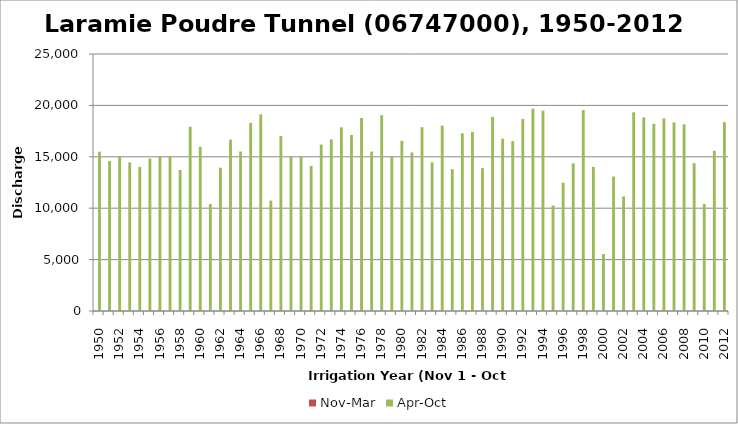
| Category | Nov-Mar | Apr-Oct |
|---|---|---|
| 1950.0 | 0 | 15495.1 |
| 1951.0 | 0 | 14582.68 |
| 1952.0 | 0 | 15068.65 |
| 1953.0 | 0 | 14451.19 |
| 1954.0 | 0 | 14017.4 |
| 1955.0 | 0 | 14818.72 |
| 1956.0 | 0 | 15005.18 |
| 1957.0 | 0 | 15054.76 |
| 1958.0 | 0 | 13717.89 |
| 1959.0 | 0 | 17926.87 |
| 1960.0 | 0 | 15978.88 |
| 1961.0 | 0 | 10407.42 |
| 1962.0 | 0 | 13943.82 |
| 1963.0 | 0 | 16671.32 |
| 1964.0 | 0 | 15514.94 |
| 1965.0 | 0 | 18297.79 |
| 1966.0 | 0 | 19130.25 |
| 1967.0 | 0 | 10740.65 |
| 1968.0 | 0 | 17034.3 |
| 1969.0 | 0 | 14999.23 |
| 1970.0 | 0 | 14989.32 |
| 1971.0 | 0 | 14114.59 |
| 1972.0 | 0 | 16189.54 |
| 1973.0 | 0 | 16691.15 |
| 1974.0 | 0 | 17873.32 |
| 1975.0 | 0 | 17127.92 |
| 1976.0 | 0 | 18775.81 |
| 1977.0 | 0 | 15511.17 |
| 1978.0 | 0 | 19052.51 |
| 1979.0 | 0 | 15044.45 |
| 1980.0 | 0 | 16554.28 |
| 1981.0 | 0 | 15421.91 |
| 1982.0 | 0 | 17880.67 |
| 1983.0 | 0 | 14465.67 |
| 1984.0 | 0 | 18033.98 |
| 1985.0 | 0 | 13789.3 |
| 1986.0 | 0 | 17292.15 |
| 1987.0 | 0 | 17423.06 |
| 1988.0 | 0 | 13898.19 |
| 1989.0 | 0 | 18884.07 |
| 1990.0 | 0 | 16759.39 |
| 1991.0 | 0 | 16533.26 |
| 1992.0 | 0 | 18683.97 |
| 1993.0 | 0 | 19687.76 |
| 1994.0 | 0 | 19488.74 |
| 1995.0 | 0 | 10263.46 |
| 1996.0 | 0 | 12478.6 |
| 1997.0 | 0 | 14368.27 |
| 1998.0 | 0 | 19545.42 |
| 1999.0 | 0 | 14019.38 |
| 2000.0 | 0 | 5547.41 |
| 2001.0 | 0 | 13080.98 |
| 2002.0 | 0 | 11148.34 |
| 2003.0 | 0 | 19329.21 |
| 2004.0 | 0 | 18845.43 |
| 2005.0 | 0 | 18210.51 |
| 2006.0 | 0 | 18733.6 |
| 2007.0 | 0 | 18343.41 |
| 2008.0 | 0 | 18163.3 |
| 2009.0 | 0 | 14385.34 |
| 2010.0 | 0 | 10403.66 |
| 2011.0 | 0 | 15593.49 |
| 2012.0 | 0 | 18375.73 |